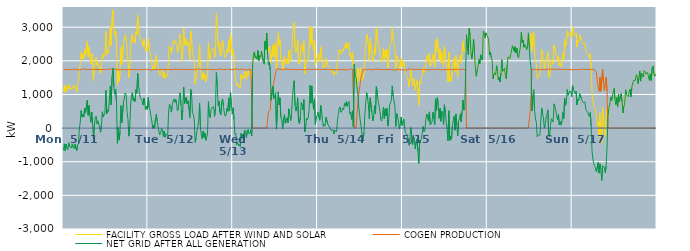
| Category | FACILITY GROSS LOAD AFTER WIND AND SOLAR | COGEN PRODUCTION | NET GRID AFTER ALL GENERATION |
|---|---|---|---|
|  Mon  5/11 | 1096 | 1757 | -661 |
|  Mon  5/11 | 1274 | 1743 | -469 |
|  Mon  5/11 | 1060 | 1737 | -677 |
|  Mon  5/11 | 1261 | 1736 | -475 |
|  Mon  5/11 | 1140 | 1742 | -602 |
|  Mon  5/11 | 1108 | 1754 | -646 |
|  Mon  5/11 | 1293 | 1730 | -437 |
|  Mon  5/11 | 1181 | 1740 | -559 |
|  Mon  5/11 | 1208 | 1742 | -534 |
|  Mon  5/11 | 1156 | 1742 | -586 |
|  Mon  5/11 | 1256 | 1727 | -471 |
|  Mon  5/11 | 1176 | 1745 | -569 |
|  Mon  5/11 | 1150 | 1766 | -616 |
|  Mon  5/11 | 1265 | 1737 | -472 |
|  Mon  5/11 | 1280 | 1738 | -458 |
|  Mon  5/11 | 1068 | 1737 | -669 |
|  Mon  5/11 | 1251 | 1745 | -494 |
|  Mon  5/11 | 1278 | 1737 | -459 |
|  Mon  5/11 | 1707 | 1726 | -19 |
|  Mon  5/11 | 1913 | 1751 | 162 |
|  Mon  5/11 | 2255 | 1736 | 519 |
|  Mon  5/11 | 2064 | 1739 | 325 |
|  Mon  5/11 | 2184 | 1765 | 419 |
|  Mon  5/11 | 2074 | 1746 | 328 |
|  Mon  5/11 | 2345 | 1756 | 589 |
|  Mon  5/11 | 2189 | 1739 | 450 |
|  Mon  5/11 | 2201 | 1740 | 461 |
|  Mon  5/11 | 2575 | 1751 | 824 |
|  Mon  5/11 | 2121 | 1742 | 379 |
|  Mon  5/11 | 2406 | 1733 | 673 |
|  Mon  5/11 | 2122 | 1747 | 375 |
|  Mon  5/11 | 1911 | 1736 | 175 |
|  Mon  5/11 | 2219 | 1741 | 478 |
|  Mon  5/11 | 1857 | 1750 | 107 |
|  Mon  5/11 | 1409 | 1746 | -337 |
|  Mon  5/11 | 1818 | 1746 | 72 |
|  Mon  5/11 | 2074 | 1754 | 320 |
|  Mon  5/11 | 2108 | 1751 | 357 |
|  Mon  5/11 | 1862 | 1739 | 123 |
|  Mon  5/11 | 1947 | 1733 | 214 |
|  Mon  5/11 | 1937 | 1738 | 199 |
|  Mon  5/11 | 1751 | 1731 | 20 |
|  Mon  5/11 | 1623 | 1745 | -122 |
|  Mon  5/11 | 1840 | 1749 | 91 |
|  Mon  5/11 | 2225 | 1739 | 486 |
|  Mon  5/11 | 2079 | 1749 | 330 |
|  Mon  5/11 | 2141 | 1737 | 404 |
|  Mon  5/11 | 2205 | 1750 | 455 |
|  Mon  5/11 | 2874 | 1751 | 1123 |
|  Mon  5/11 | 2177 | 1748 | 429 |
|  Mon  5/11 | 2280 | 1736 | 544 |
|  Mon  5/11 | 2240 | 1746 | 494 |
|  Mon  5/11 | 2267 | 1756 | 511 |
|  Mon  5/11 | 2994 | 1744 | 1250 |
|  Mon  5/11 | 2445 | 1752 | 693 |
|  Mon  5/11 | 3262 | 1740 | 1522 |
|  Mon  5/11 | 3521 | 1747 | 1774 |
|  Mon  5/11 | 3010 | 1759 | 1251 |
|  Mon  5/11 | 2769 | 1763 | 1006 |
|  Mon  5/11 | 2885 | 1736 | 1149 |
|  Mon  5/11 | 2522 | 1738 | 784 |
|  Mon  5/11 | 1294 | 1747 | -453 |
|  Mon  5/11 | 1755 | 1736 | 19 |
|  Mon  5/11 | 1386 | 1746 | -360 |
|  Mon  5/11 | 1616 | 1737 | -121 |
|  Mon  5/11 | 2411 | 1740 | 671 |
|  Mon  5/11 | 1898 | 1745 | 153 |
|  Mon  5/11 | 1900 | 1731 | 169 |
|  Mon  5/11 | 2516 | 1736 | 780 |
|  Mon  5/11 | 2514 | 1753 | 761 |
|  Mon  5/11 | 2785 | 1739 | 1046 |
|  Mon  5/11 | 2720 | 1743 | 977 |
|  Mon  5/11 | 2223 | 1737 | 486 |
|  Mon  5/11 | 1995 | 1743 | 252 |
|  Mon  5/11 | 1499 | 1739 | -240 |
|  Mon  5/11 | 1786 | 1745 | 41 |
|  Mon  5/11 | 2424 | 1743 | 681 |
|  Mon  5/11 | 2723 | 1742 | 981 |
|  Mon  5/11 | 2797 | 1746 | 1051 |
|  Mon  5/11 | 2565 | 1746 | 819 |
|  Mon  5/11 | 2628 | 1742 | 886 |
|  Mon  5/11 | 2523 | 1735 | 788 |
|  Mon  5/11 | 2875 | 1735 | 1140 |
|  Mon  5/11 | 2781 | 1747 | 1034 |
|  Mon  5/11 | 3363 | 1740 | 1623 |
|  Mon  5/11 | 3005 | 1740 | 1265 |
|  Mon  5/11 | 2765 | 1734 | 1031 |
|  Mon  5/11 | 2640 | 1735 | 905 |
|  Mon  5/11 | 2640 | 1743 | 897 |
|  Mon  5/11 | 2580 | 1751 | 829 |
|  Mon  5/11 | 2417 | 1734 | 683 |
|  Mon  5/11 | 2642 | 1748 | 894 |
|  Mon  5/11 | 2472 | 1745 | 727 |
|  Mon  5/11 | 2272 | 1729 | 543 |
|  Mon  5/11 | 2399 | 1744 | 655 |
|  Mon  5/11 | 2314 | 1753 | 561 |
|  Tue  5/12 | 2673 | 1751 | 922 |
|  Tue  5/12 | 2374 | 1759 | 615 |
|  Tue  5/12 | 2272 | 1729 | 543 |
|  Tue  5/12 | 2081 | 1733 | 348 |
|  Tue  5/12 | 1936 | 1725 | 211 |
|  Tue  5/12 | 1731 | 1740 | -9 |
|  Tue  5/12 | 1830 | 1744 | 86 |
|  Tue  5/12 | 1733 | 1740 | -7 |
|  Tue  5/12 | 1993 | 1737 | 256 |
|  Tue  5/12 | 2169 | 1754 | 415 |
|  Tue  5/12 | 1950 | 1740 | 210 |
|  Tue  5/12 | 1802 | 1750 | 52 |
|  Tue  5/12 | 1637 | 1732 | -95 |
|  Tue  5/12 | 1557 | 1763 | -206 |
|  Tue  5/12 | 1605 | 1730 | -125 |
|  Tue  5/12 | 1732 | 1741 | -9 |
|  Tue  5/12 | 1696 | 1751 | -55 |
|  Tue  5/12 | 1493 | 1741 | -248 |
|  Tue  5/12 | 1653 | 1741 | -88 |
|  Tue  5/12 | 1471 | 1743 | -272 |
|  Tue  5/12 | 1562 | 1742 | -180 |
|  Tue  5/12 | 1588 | 1742 | -154 |
|  Tue  5/12 | 1561 | 1748 | -187 |
|  Tue  5/12 | 2258 | 1748 | 510 |
|  Tue  5/12 | 2450 | 1740 | 710 |
|  Tue  5/12 | 2387 | 1722 | 665 |
|  Tue  5/12 | 2212 | 1736 | 476 |
|  Tue  5/12 | 2380 | 1740 | 640 |
|  Tue  5/12 | 2547 | 1743 | 804 |
|  Tue  5/12 | 2629 | 1758 | 871 |
|  Tue  5/12 | 2516 | 1753 | 763 |
|  Tue  5/12 | 2581 | 1731 | 850 |
|  Tue  5/12 | 2482 | 1752 | 730 |
|  Tue  5/12 | 2244 | 1735 | 509 |
|  Tue  5/12 | 2340 | 1738 | 602 |
|  Tue  5/12 | 2636 | 1736 | 900 |
|  Tue  5/12 | 2790 | 1743 | 1047 |
|  Tue  5/12 | 2416 | 1735 | 681 |
|  Tue  5/12 | 1988 | 1747 | 241 |
|  Tue  5/12 | 2279 | 1746 | 533 |
|  Tue  5/12 | 2968 | 1747 | 1221 |
|  Tue  5/12 | 2452 | 1728 | 724 |
|  Tue  5/12 | 2455 | 1749 | 706 |
|  Tue  5/12 | 2667 | 1748 | 919 |
|  Tue  5/12 | 2460 | 1741 | 719 |
|  Tue  5/12 | 2561 | 1753 | 808 |
|  Tue  5/12 | 2321 | 1751 | 570 |
|  Tue  5/12 | 2040 | 1731 | 309 |
|  Tue  5/12 | 2885 | 1735 | 1150 |
|  Tue  5/12 | 2731 | 1743 | 988 |
|  Tue  5/12 | 2189 | 1745 | 444 |
|  Tue  5/12 | 2154 | 1742 | 412 |
|  Tue  5/12 | 1979 | 1733 | 246 |
|  Tue  5/12 | 1304 | 1726 | -422 |
|  Tue  5/12 | 1452 | 1755 | -303 |
|  Tue  5/12 | 1640 | 1739 | -99 |
|  Tue  5/12 | 1792 | 1753 | 39 |
|  Tue  5/12 | 1944 | 1727 | 217 |
|  Tue  5/12 | 2491 | 1746 | 745 |
|  Tue  5/12 | 1767 | 1751 | 16 |
|  Tue  5/12 | 1522 | 1742 | -220 |
|  Tue  5/12 | 1426 | 1741 | -315 |
|  Tue  5/12 | 1648 | 1734 | -86 |
|  Tue  5/12 | 1467 | 1743 | -276 |
|  Tue  5/12 | 1598 | 1741 | -143 |
|  Tue  5/12 | 1383 | 1745 | -362 |
|  Tue  5/12 | 1471 | 1747 | -276 |
|  Tue  5/12 | 1554 | 1728 | -174 |
|  Tue  5/12 | 2548 | 1757 | 791 |
|  Tue  5/12 | 2080 | 1729 | 351 |
|  Tue  5/12 | 2040 | 1737 | 303 |
|  Tue  5/12 | 2286 | 1740 | 546 |
|  Tue  5/12 | 2346 | 1745 | 601 |
|  Tue  5/12 | 2338 | 1750 | 588 |
|  Tue  5/12 | 2372 | 1735 | 637 |
|  Tue  5/12 | 2103 | 1753 | 350 |
|  Tue  5/12 | 2309 | 1742 | 567 |
|  Tue  5/12 | 3404 | 1750 | 1654 |
|  Tue  5/12 | 3024 | 1743 | 1281 |
|  Tue  5/12 | 2415 | 1742 | 673 |
|  Tue  5/12 | 2564 | 1764 | 800 |
|  Tue  5/12 | 2205 | 1744 | 461 |
|  Tue  5/12 | 2144 | 1749 | 395 |
|  Tue  5/12 | 2508 | 1743 | 765 |
|  Tue  5/12 | 2609 | 1741 | 868 |
|  Tue  5/12 | 2388 | 1736 | 652 |
|  Tue  5/12 | 2185 | 1737 | 448 |
|  Tue  5/12 | 2092 | 1738 | 354 |
|  Tue  5/12 | 2142 | 1745 | 397 |
|  Tue  5/12 | 2330 | 1745 | 585 |
|  Tue  5/12 | 2256 | 1756 | 500 |
|  Tue  5/12 | 2633 | 1736 | 897 |
|  Tue  5/12 | 2263 | 1744 | 519 |
|  Tue  5/12 | 2821 | 1751 | 1070 |
|  Tue  5/12 | 2431 | 1739 | 692 |
|  Tue  5/12 | 2165 | 1751 | 414 |
|  Wed  5/13 | 2344 | 1742 | 602 |
|  Wed  5/13 | 2010 | 1760 | 250 |
|  Wed  5/13 | 1566 | 1752 | -186 |
|  Wed  5/13 | 1588 | 1740 | -152 |
|  Wed  5/13 | 1269 | 1760 | -491 |
|  Wed  5/13 | 1335 | 1758 | -423 |
|  Wed  5/13 | 1218 | 1747 | -529 |
|  Wed  5/13 | 1265 | 1749 | -484 |
|  Wed  5/13 | 1199 | 1743 | -544 |
|  Wed  5/13 | 1594 | 1753 | -159 |
|  Wed  5/13 | 1482 | 1764 | -282 |
|  Wed  5/13 | 1552 | 1738 | -186 |
|  Wed  5/13 | 1460 | 1733 | -273 |
|  Wed  5/13 | 1701 | 1756 | -55 |
|  Wed  5/13 | 1626 | 1736 | -110 |
|  Wed  5/13 | 1448 | 1738 | -290 |
|  Wed  5/13 | 1657 | 1740 | -83 |
|  Wed  5/13 | 1701 | 1735 | -34 |
|  Wed  5/13 | 1565 | 1746 | -181 |
|  Wed  5/13 | 1611 | 1758 | -147 |
|  Wed  5/13 | 1691 | 1746 | -55 |
|  Wed  5/13 | 1507 | 1742 | -235 |
|  Wed  5/13 | 1882 | 0 | 1882 |
|  Wed  5/13 | 2196 | 0 | 2196 |
|  Wed  5/13 | 2265 | 0 | 2265 |
|  Wed  5/13 | 2086 | 0 | 2086 |
|  Wed  5/13 | 2120 | 0 | 2120 |
|  Wed  5/13 | 2046 | 0 | 2046 |
|  Wed  5/13 | 2305 | 0 | 2305 |
|  Wed  5/13 | 2005 | 0 | 2005 |
|  Wed  5/13 | 2158 | 0 | 2158 |
|  Wed  5/13 | 2108 | 0 | 2108 |
|  Wed  5/13 | 2291 | 0 | 2291 |
|  Wed  5/13 | 2277 | 0 | 2277 |
|  Wed  5/13 | 1986 | 0 | 1986 |
|  Wed  5/13 | 1898 | 0 | 1898 |
|  Wed  5/13 | 2581 | 0 | 2581 |
|  Wed  5/13 | 2338 | 0 | 2338 |
|  Wed  5/13 | 2827 | 0 | 2827 |
|  Wed  5/13 | 2188 | 0 | 2188 |
|  Wed  5/13 | 2377 | 497 | 1880 |
|  Wed  5/13 | 2441 | 491 | 1950 |
|  Wed  5/13 | 2241 | 532 | 1709 |
|  Wed  5/13 | 1952 | 1124 | 828 |
|  Wed  5/13 | 1957 | 1141 | 816 |
|  Wed  5/13 | 2472 | 1234 | 1238 |
|  Wed  5/13 | 2123 | 1244 | 879 |
|  Wed  5/13 | 2437 | 1491 | 946 |
|  Wed  5/13 | 2550 | 1501 | 1049 |
|  Wed  5/13 | 1721 | 1752 | -31 |
|  Wed  5/13 | 2329 | 1750 | 579 |
|  Wed  5/13 | 2840 | 1762 | 1078 |
|  Wed  5/13 | 2447 | 1754 | 693 |
|  Wed  5/13 | 2645 | 1746 | 899 |
|  Wed  5/13 | 2059 | 1740 | 319 |
|  Wed  5/13 | 1981 | 1744 | 237 |
|  Wed  5/13 | 1723 | 1742 | -19 |
|  Wed  5/13 | 2013 | 1729 | 284 |
|  Wed  5/13 | 2147 | 1748 | 399 |
|  Wed  5/13 | 1894 | 1750 | 144 |
|  Wed  5/13 | 1948 | 1732 | 216 |
|  Wed  5/13 | 2066 | 1760 | 306 |
|  Wed  5/13 | 1906 | 1742 | 164 |
|  Wed  5/13 | 2318 | 1746 | 572 |
|  Wed  5/13 | 2152 | 1745 | 407 |
|  Wed  5/13 | 1969 | 1747 | 222 |
|  Wed  5/13 | 2125 | 1741 | 384 |
|  Wed  5/13 | 2635 | 1752 | 883 |
|  Wed  5/13 | 2939 | 1742 | 1197 |
|  Wed  5/13 | 3138 | 1729 | 1409 |
|  Wed  5/13 | 2400 | 1739 | 661 |
|  Wed  5/13 | 2253 | 1748 | 505 |
|  Wed  5/13 | 2360 | 1735 | 625 |
|  Wed  5/13 | 2630 | 1731 | 899 |
|  Wed  5/13 | 1943 | 1746 | 197 |
|  Wed  5/13 | 1876 | 1747 | 129 |
|  Wed  5/13 | 2084 | 1749 | 335 |
|  Wed  5/13 | 2501 | 1742 | 759 |
|  Wed  5/13 | 2444 | 1746 | 698 |
|  Wed  5/13 | 2273 | 1735 | 538 |
|  Wed  5/13 | 2597 | 1750 | 847 |
|  Wed  5/13 | 1615 | 1732 | -117 |
|  Wed  5/13 | 1732 | 1724 | 8 |
|  Wed  5/13 | 2030 | 1738 | 292 |
|  Wed  5/13 | 1987 | 1744 | 243 |
|  Wed  5/13 | 2085 | 1758 | 327 |
|  Wed  5/13 | 2323 | 1749 | 574 |
|  Wed  5/13 | 3018 | 1744 | 1274 |
|  Wed  5/13 | 2485 | 1744 | 741 |
|  Wed  5/13 | 2994 | 1740 | 1254 |
|  Wed  5/13 | 2492 | 1731 | 761 |
|  Wed  5/13 | 2312 | 1752 | 560 |
|  Wed  5/13 | 2617 | 1748 | 869 |
|  Wed  5/13 | 1856 | 1752 | 104 |
|  Wed  5/13 | 2070 | 1743 | 327 |
|  Wed  5/13 | 2112 | 1738 | 374 |
|  Thu  5/14 | 2198 | 1729 | 469 |
|  Thu  5/14 | 2199 | 1751 | 448 |
|  Thu  5/14 | 1962 | 1728 | 234 |
|  Thu  5/14 | 2415 | 1742 | 673 |
|  Thu  5/14 | 2274 | 1759 | 515 |
|  Thu  5/14 | 1982 | 1747 | 235 |
|  Thu  5/14 | 1790 | 1743 | 47 |
|  Thu  5/14 | 1870 | 1750 | 120 |
|  Thu  5/14 | 1817 | 1744 | 73 |
|  Thu  5/14 | 2077 | 1749 | 328 |
|  Thu  5/14 | 2075 | 1740 | 335 |
|  Thu  5/14 | 1862 | 1743 | 119 |
|  Thu  5/14 | 1874 | 1754 | 120 |
|  Thu  5/14 | 1782 | 1755 | 27 |
|  Thu  5/14 | 1750 | 1734 | 16 |
|  Thu  5/14 | 1653 | 1730 | -77 |
|  Thu  5/14 | 1668 | 1738 | -70 |
|  Thu  5/14 | 1697 | 1742 | -45 |
|  Thu  5/14 | 1563 | 1734 | -171 |
|  Thu  5/14 | 1668 | 1738 | -70 |
|  Thu  5/14 | 1647 | 1743 | -96 |
|  Thu  5/14 | 1630 | 1735 | -105 |
|  Thu  5/14 | 1975 | 1732 | 243 |
|  Thu  5/14 | 2159 | 1753 | 406 |
|  Thu  5/14 | 2349 | 1749 | 600 |
|  Thu  5/14 | 2369 | 1737 | 632 |
|  Thu  5/14 | 2206 | 1736 | 470 |
|  Thu  5/14 | 2253 | 1733 | 520 |
|  Thu  5/14 | 2352 | 1758 | 594 |
|  Thu  5/14 | 2292 | 1746 | 546 |
|  Thu  5/14 | 2466 | 1732 | 734 |
|  Thu  5/14 | 2394 | 1735 | 659 |
|  Thu  5/14 | 2546 | 1757 | 789 |
|  Thu  5/14 | 2365 | 1719 | 646 |
|  Thu  5/14 | 2491 | 1744 | 747 |
|  Thu  5/14 | 2538 | 1744 | 794 |
|  Thu  5/14 | 2156 | 1739 | 417 |
|  Thu  5/14 | 2229 | 1764 | 465 |
|  Thu  5/14 | 2026 | 1768 | 258 |
|  Thu  5/14 | 2258 | 1747 | 511 |
|  Thu  5/14 | 1793 | 1754 | 39 |
|  Thu  5/14 | 1894 | 0 | 1894 |
|  Thu  5/14 | 1547 | 0 | 1547 |
|  Thu  5/14 | 1500 | 0 | 1500 |
|  Thu  5/14 | 1246 | 0 | 1246 |
|  Thu  5/14 | 1786 | 736 | 1050 |
|  Thu  5/14 | 1638 | 983 | 655 |
|  Thu  5/14 | 1386 | 985 | 401 |
|  Thu  5/14 | 1808 | 1382 | 426 |
|  Thu  5/14 | 1531 | 1546 | -15 |
|  Thu  5/14 | 1415 | 1651 | -236 |
|  Thu  5/14 | 1396 | 1735 | -339 |
|  Thu  5/14 | 1602 | 1734 | -132 |
|  Thu  5/14 | 2155 | 1740 | 415 |
|  Thu  5/14 | 2498 | 1742 | 756 |
|  Thu  5/14 | 2793 | 1735 | 1058 |
|  Thu  5/14 | 2655 | 1750 | 905 |
|  Thu  5/14 | 2447 | 1749 | 698 |
|  Thu  5/14 | 2026 | 1745 | 281 |
|  Thu  5/14 | 2652 | 1750 | 902 |
|  Thu  5/14 | 2661 | 1739 | 922 |
|  Thu  5/14 | 2205 | 1733 | 472 |
|  Thu  5/14 | 1965 | 1751 | 214 |
|  Thu  5/14 | 2096 | 1731 | 365 |
|  Thu  5/14 | 2412 | 1745 | 667 |
|  Thu  5/14 | 2176 | 1754 | 422 |
|  Thu  5/14 | 2985 | 1753 | 1232 |
|  Thu  5/14 | 2815 | 1745 | 1070 |
|  Thu  5/14 | 2532 | 1752 | 780 |
|  Thu  5/14 | 2440 | 1762 | 678 |
|  Thu  5/14 | 2248 | 1750 | 498 |
|  Thu  5/14 | 1992 | 1736 | 256 |
|  Thu  5/14 | 1953 | 1746 | 207 |
|  Thu  5/14 | 2121 | 1744 | 377 |
|  Thu  5/14 | 2373 | 1749 | 624 |
|  Thu  5/14 | 2018 | 1732 | 286 |
|  Thu  5/14 | 2322 | 1747 | 575 |
|  Thu  5/14 | 2106 | 1745 | 361 |
|  Thu  5/14 | 2333 | 1743 | 590 |
|  Thu  5/14 | 1796 | 1736 | 60 |
|  Thu  5/14 | 1999 | 1756 | 243 |
|  Thu  5/14 | 2450 | 1755 | 695 |
|  Thu  5/14 | 2498 | 1760 | 738 |
|  Thu  5/14 | 2580 | 1740 | 840 |
|  Thu  5/14 | 2994 | 1740 | 1254 |
|  Thu  5/14 | 2679 | 1731 | 948 |
|  Thu  5/14 | 2702 | 1745 | 957 |
|  Thu  5/14 | 2367 | 1722 | 645 |
|  Thu  5/14 | 1780 | 1733 | 47 |
|  Thu  5/14 | 2156 | 1728 | 428 |
|  Thu  5/14 | 2109 | 1747 | 362 |
|  Thu  5/14 | 1950 | 1748 | 202 |
|  Thu  5/14 | 1705 | 1734 | -29 |
|  Thu  5/14 | 1844 | 1739 | 105 |
|  Thu  5/14 | 2071 | 1743 | 328 |
|  Thu  5/14 | 1818 | 1737 | 81 |
|  Fri  5/15 | 1838 | 1741 | 97 |
|  Fri  5/15 | 1981 | 1719 | 262 |
|  Fri  5/15 | 1743 | 1746 | -3 |
|  Fri  5/15 | 1601 | 1732 | -131 |
|  Fri  5/15 | 1565 | 1739 | -174 |
|  Fri  5/15 | 1487 | 1720 | -233 |
|  Fri  5/15 | 1426 | 1752 | -326 |
|  Fri  5/15 | 1226 | 1735 | -509 |
|  Fri  5/15 | 1473 | 1771 | -298 |
|  Fri  5/15 | 1749 | 1734 | 15 |
|  Fri  5/15 | 1490 | 1743 | -253 |
|  Fri  5/15 | 1249 | 1740 | -491 |
|  Fri  5/15 | 1491 | 1743 | -252 |
|  Fri  5/15 | 1411 | 1750 | -339 |
|  Fri  5/15 | 1134 | 1754 | -620 |
|  Fri  5/15 | 1327 | 1746 | -419 |
|  Fri  5/15 | 1415 | 1742 | -327 |
|  Fri  5/15 | 1061 | 1748 | -687 |
|  Fri  5/15 | 676 | 1727 | -1051 |
|  Fri  5/15 | 1388 | 1743 | -355 |
|  Fri  5/15 | 1330 | 1740 | -410 |
|  Fri  5/15 | 1447 | 1744 | -297 |
|  Fri  5/15 | 1601 | 1744 | -143 |
|  Fri  5/15 | 1796 | 1746 | 50 |
|  Fri  5/15 | 1644 | 1747 | -103 |
|  Fri  5/15 | 1690 | 1740 | -50 |
|  Fri  5/15 | 1995 | 1741 | 254 |
|  Fri  5/15 | 2160 | 1742 | 418 |
|  Fri  5/15 | 2063 | 1752 | 311 |
|  Fri  5/15 | 1938 | 1731 | 207 |
|  Fri  5/15 | 2231 | 1749 | 482 |
|  Fri  5/15 | 1841 | 1742 | 99 |
|  Fri  5/15 | 1822 | 1738 | 84 |
|  Fri  5/15 | 1923 | 1740 | 183 |
|  Fri  5/15 | 2204 | 1732 | 472 |
|  Fri  5/15 | 2044 | 1748 | 296 |
|  Fri  5/15 | 1818 | 1720 | 98 |
|  Fri  5/15 | 2610 | 1740 | 870 |
|  Fri  5/15 | 2258 | 1750 | 508 |
|  Fri  5/15 | 2662 | 1752 | 910 |
|  Fri  5/15 | 2428 | 1746 | 682 |
|  Fri  5/15 | 2038 | 1750 | 288 |
|  Fri  5/15 | 2339 | 1754 | 585 |
|  Fri  5/15 | 1940 | 1738 | 202 |
|  Fri  5/15 | 2245 | 1740 | 505 |
|  Fri  5/15 | 2191 | 1727 | 464 |
|  Fri  5/15 | 1829 | 1736 | 93 |
|  Fri  5/15 | 2429 | 1736 | 693 |
|  Fri  5/15 | 2224 | 1747 | 477 |
|  Fri  5/15 | 1937 | 1737 | 200 |
|  Fri  5/15 | 1698 | 1727 | -29 |
|  Fri  5/15 | 1371 | 1750 | -379 |
|  Fri  5/15 | 2256 | 1741 | 515 |
|  Fri  5/15 | 1382 | 1749 | -367 |
|  Fri  5/15 | 1505 | 1738 | -233 |
|  Fri  5/15 | 1412 | 1743 | -331 |
|  Fri  5/15 | 1803 | 1747 | 56 |
|  Fri  5/15 | 1939 | 1733 | 206 |
|  Fri  5/15 | 2084 | 1735 | 349 |
|  Fri  5/15 | 1690 | 1753 | -63 |
|  Fri  5/15 | 2160 | 1737 | 423 |
|  Fri  5/15 | 1842 | 1747 | 95 |
|  Fri  5/15 | 1508 | 1739 | -231 |
|  Fri  5/15 | 1966 | 1749 | 217 |
|  Fri  5/15 | 2016 | 1741 | 275 |
|  Fri  5/15 | 2157 | 1733 | 424 |
|  Fri  5/15 | 1932 | 1747 | 185 |
|  Fri  5/15 | 2251 | 1753 | 498 |
|  Fri  5/15 | 2581 | 1743 | 838 |
|  Fri  5/15 | 2274 | 1742 | 532 |
|  Fri  5/15 | 2331 | 1743 | 588 |
|  Fri  5/15 | 2295 | 1735 | 560 |
|  Fri  5/15 | 2773 | 0 | 2773 |
|  Fri  5/15 | 2378 | 0 | 2378 |
|  Fri  5/15 | 2180 | 0 | 2180 |
|  Fri  5/15 | 2965 | 0 | 2965 |
|  Fri  5/15 | 2763 | 0 | 2763 |
|  Fri  5/15 | 2267 | 0 | 2267 |
|  Fri  5/15 | 2057 | 0 | 2057 |
|  Fri  5/15 | 2308 | 0 | 2308 |
|  Fri  5/15 | 2639 | 0 | 2639 |
|  Fri  5/15 | 2246 | 0 | 2246 |
|  Fri  5/15 | 1819 | 0 | 1819 |
|  Fri  5/15 | 1541 | 0 | 1541 |
|  Fri  5/15 | 1702 | 0 | 1702 |
|  Fri  5/15 | 1832 | 0 | 1832 |
|  Fri  5/15 | 2035 | 0 | 2035 |
|  Fri  5/15 | 1909 | 0 | 1909 |
|  Fri  5/15 | 2180 | 0 | 2180 |
|  Fri  5/15 | 2053 | 0 | 2053 |
|  Fri  5/15 | 2018 | 0 | 2018 |
|  Fri  5/15 | 2886 | 0 | 2886 |
|  Fri  5/15 | 2843 | 0 | 2843 |
|  Fri  5/15 | 2681 | 0 | 2681 |
|  Fri  5/15 | 2831 | 0 | 2831 |
|  Fri  5/15 | 2819 | 0 | 2819 |
|  Sat  5/16 | 2715 | 0 | 2715 |
|  Sat  5/16 | 2621 | 0 | 2621 |
|  Sat  5/16 | 2176 | 0 | 2176 |
|  Sat  5/16 | 2263 | 0 | 2263 |
|  Sat  5/16 | 2096 | 0 | 2096 |
|  Sat  5/16 | 2013 | 0 | 2013 |
|  Sat  5/16 | 1468 | 0 | 1468 |
|  Sat  5/16 | 1587 | 0 | 1587 |
|  Sat  5/16 | 1644 | 0 | 1644 |
|  Sat  5/16 | 1592 | 0 | 1592 |
|  Sat  5/16 | 1856 | 0 | 1856 |
|  Sat  5/16 | 1689 | 0 | 1689 |
|  Sat  5/16 | 1436 | 0 | 1436 |
|  Sat  5/16 | 1513 | 0 | 1513 |
|  Sat  5/16 | 1370 | 0 | 1370 |
|  Sat  5/16 | 1643 | 0 | 1643 |
|  Sat  5/16 | 2030 | 0 | 2030 |
|  Sat  5/16 | 1688 | 0 | 1688 |
|  Sat  5/16 | 1660 | 0 | 1660 |
|  Sat  5/16 | 1776 | 0 | 1776 |
|  Sat  5/16 | 1556 | 0 | 1556 |
|  Sat  5/16 | 1467 | 0 | 1467 |
|  Sat  5/16 | 1876 | 0 | 1876 |
|  Sat  5/16 | 2120 | 0 | 2120 |
|  Sat  5/16 | 2146 | 0 | 2146 |
|  Sat  5/16 | 2062 | 0 | 2062 |
|  Sat  5/16 | 2198 | 0 | 2198 |
|  Sat  5/16 | 2194 | 0 | 2194 |
|  Sat  5/16 | 2447 | 0 | 2447 |
|  Sat  5/16 | 2461 | 0 | 2461 |
|  Sat  5/16 | 2279 | 0 | 2279 |
|  Sat  5/16 | 2419 | 0 | 2419 |
|  Sat  5/16 | 2231 | 0 | 2231 |
|  Sat  5/16 | 2373 | 0 | 2373 |
|  Sat  5/16 | 2133 | 0 | 2133 |
|  Sat  5/16 | 2084 | 0 | 2084 |
|  Sat  5/16 | 2260 | 0 | 2260 |
|  Sat  5/16 | 2423 | 0 | 2423 |
|  Sat  5/16 | 2850 | 0 | 2850 |
|  Sat  5/16 | 2533 | 0 | 2533 |
|  Sat  5/16 | 2610 | 0 | 2610 |
|  Sat  5/16 | 2403 | 0 | 2403 |
|  Sat  5/16 | 2484 | 0 | 2484 |
|  Sat  5/16 | 2423 | 0 | 2423 |
|  Sat  5/16 | 2334 | 0 | 2334 |
|  Sat  5/16 | 2454 | 0 | 2454 |
|  Sat  5/16 | 2831 | 0 | 2831 |
|  Sat  5/16 | 2419 | 0 | 2419 |
|  Sat  5/16 | 2478 | 498 | 1980 |
|  Sat  5/16 | 2818 | 999 | 1819 |
|  Sat  5/16 | 2266 | 1758 | 508 |
|  Sat  5/16 | 2699 | 1757 | 942 |
|  Sat  5/16 | 2878 | 1736 | 1142 |
|  Sat  5/16 | 2275 | 1748 | 527 |
|  Sat  5/16 | 2025 | 1752 | 273 |
|  Sat  5/16 | 1910 | 1743 | 167 |
|  Sat  5/16 | 1476 | 1738 | -262 |
|  Sat  5/16 | 1527 | 1743 | -216 |
|  Sat  5/16 | 1506 | 1732 | -226 |
|  Sat  5/16 | 1545 | 1749 | -204 |
|  Sat  5/16 | 1546 | 1743 | -197 |
|  Sat  5/16 | 2334 | 1734 | 600 |
|  Sat  5/16 | 2175 | 1737 | 438 |
|  Sat  5/16 | 2058 | 1744 | 314 |
|  Sat  5/16 | 1748 | 1751 | -3 |
|  Sat  5/16 | 1848 | 1751 | 97 |
|  Sat  5/16 | 2052 | 1723 | 329 |
|  Sat  5/16 | 2131 | 1757 | 374 |
|  Sat  5/16 | 2273 | 1730 | 543 |
|  Sat  5/16 | 1539 | 1743 | -204 |
|  Sat  5/16 | 1490 | 1742 | -252 |
|  Sat  5/16 | 1831 | 1755 | 76 |
|  Sat  5/16 | 2024 | 1744 | 280 |
|  Sat  5/16 | 2032 | 1746 | 286 |
|  Sat  5/16 | 1913 | 1727 | 186 |
|  Sat  5/16 | 2470 | 1750 | 720 |
|  Sat  5/16 | 2395 | 1751 | 644 |
|  Sat  5/16 | 2377 | 1745 | 632 |
|  Sat  5/16 | 2104 | 1739 | 365 |
|  Sat  5/16 | 1994 | 1751 | 243 |
|  Sat  5/16 | 2148 | 1746 | 402 |
|  Sat  5/16 | 1852 | 1753 | 99 |
|  Sat  5/16 | 1915 | 1725 | 190 |
|  Sat  5/16 | 1821 | 1732 | 89 |
|  Sat  5/16 | 1969 | 1746 | 223 |
|  Sat  5/16 | 2213 | 1747 | 466 |
|  Sat  5/16 | 2017 | 1737 | 280 |
|  Sat  5/16 | 2642 | 1748 | 894 |
|  Sat  5/16 | 2426 | 1746 | 680 |
|  Sat  5/16 | 2545 | 1746 | 799 |
|  Sat  5/16 | 2893 | 1746 | 1147 |
|  Sat  5/16 | 2717 | 1738 | 979 |
|  Sat  5/16 | 2695 | 1735 | 960 |
|  Sat  5/16 | 2850 | 1745 | 1105 |
|  Sat  5/16 | 2816 | 1742 | 1074 |
|  Sat  5/16 | 2667 | 1737 | 930 |
|  Sun  5/17 | 3009 | 1746 | 1263 |
|  Sun  5/17 | 2874 | 1733 | 1141 |
|  Sun  5/17 | 2879 | 1733 | 1146 |
|  Sun  5/17 | 2769 | 1743 | 1026 |
|  Sun  5/17 | 2829 | 1737 | 1092 |
|  Sun  5/17 | 2419 | 1731 | 688 |
|  Sun  5/17 | 2604 | 1738 | 866 |
|  Sun  5/17 | 2564 | 1745 | 819 |
|  Sun  5/17 | 2774 | 1749 | 1025 |
|  Sun  5/17 | 2755 | 1742 | 1013 |
|  Sun  5/17 | 2615 | 1744 | 871 |
|  Sun  5/17 | 2623 | 1755 | 868 |
|  Sun  5/17 | 2489 | 1735 | 754 |
|  Sun  5/17 | 2497 | 1744 | 753 |
|  Sun  5/17 | 2521 | 1744 | 777 |
|  Sun  5/17 | 2297 | 1745 | 552 |
|  Sun  5/17 | 2263 | 1738 | 525 |
|  Sun  5/17 | 2223 | 1750 | 473 |
|  Sun  5/17 | 2134 | 1744 | 390 |
|  Sun  5/17 | 2081 | 1738 | 343 |
|  Sun  5/17 | 2209 | 1745 | 464 |
|  Sun  5/17 | 1811 | 1747 | 64 |
|  Sun  5/17 | 1057 | 1743 | -686 |
|  Sun  5/17 | 825 | 1740 | -915 |
|  Sun  5/17 | 678 | 1738 | -1060 |
|  Sun  5/17 | 617 | 1733 | -1116 |
|  Sun  5/17 | 614 | 1738 | -1124 |
|  Sun  5/17 | 350 | 1652 | -1302 |
|  Sun  5/17 | 82 | 1380 | -1298 |
|  Sun  5/17 | 185 | 1205 | -1020 |
|  Sun  5/17 | -245 | 1096 | -1341 |
|  Sun  5/17 | 453 | 1517 | -1064 |
|  Sun  5/17 | -142 | 1093 | -1235 |
|  Sun  5/17 | -451 | 1102 | -1553 |
|  Sun  5/17 | 625 | 1748 | -1123 |
|  Sun  5/17 | 207 | 1319 | -1112 |
|  Sun  5/17 | -45 | 1121 | -1166 |
|  Sun  5/17 | -241 | 1095 | -1336 |
|  Sun  5/17 | 388 | 1513 | -1125 |
|  Sun  5/17 | 562 | 1096 | -534 |
|  Sun  5/17 | 328 | 0 | 328 |
|  Sun  5/17 | 591 | 0 | 591 |
|  Sun  5/17 | 686 | 0 | 686 |
|  Sun  5/17 | 919 | 0 | 919 |
|  Sun  5/17 | 806 | 0 | 806 |
|  Sun  5/17 | 957 | 0 | 957 |
|  Sun  5/17 | 938 | 0 | 938 |
|  Sun  5/17 | 1178 | 0 | 1178 |
|  Sun  5/17 | 846 | 0 | 846 |
|  Sun  5/17 | 697 | 0 | 697 |
|  Sun  5/17 | 909 | 0 | 909 |
|  Sun  5/17 | 633 | 0 | 633 |
|  Sun  5/17 | 1004 | 0 | 1004 |
|  Sun  5/17 | 786 | 0 | 786 |
|  Sun  5/17 | 930 | 0 | 930 |
|  Sun  5/17 | 1023 | 0 | 1023 |
|  Sun  5/17 | 781 | 0 | 781 |
|  Sun  5/17 | 451 | 0 | 451 |
|  Sun  5/17 | 635 | 0 | 635 |
|  Sun  5/17 | 745 | 0 | 745 |
|  Sun  5/17 | 1138 | 0 | 1138 |
|  Sun  5/17 | 999 | 0 | 999 |
|  Sun  5/17 | 1001 | 0 | 1001 |
|  Sun  5/17 | 933 | 0 | 933 |
|  Sun  5/17 | 1069 | 0 | 1069 |
|  Sun  5/17 | 1152 | 0 | 1152 |
|  Sun  5/17 | 927 | 0 | 927 |
|  Sun  5/17 | 1208 | 0 | 1208 |
|  Sun  5/17 | 1339 | 0 | 1339 |
|  Sun  5/17 | 1419 | 0 | 1419 |
|  Sun  5/17 | 1401 | 0 | 1401 |
|  Sun  5/17 | 1420 | 0 | 1420 |
|  Sun  5/17 | 1589 | 0 | 1589 |
|  Sun  5/17 | 1554 | 0 | 1554 |
|  Sun  5/17 | 1323 | 0 | 1323 |
|  Sun  5/17 | 1481 | 0 | 1481 |
|  Sun  5/17 | 1699 | 0 | 1699 |
|  Sun  5/17 | 1396 | 0 | 1396 |
|  Sun  5/17 | 1632 | 0 | 1632 |
|  Sun  5/17 | 1569 | 0 | 1569 |
|  Sun  5/17 | 1512 | 0 | 1512 |
|  Sun  5/17 | 1712 | 0 | 1712 |
|  Sun  5/17 | 1676 | 0 | 1676 |
|  Sun  5/17 | 1605 | 0 | 1605 |
|  Sun  5/17 | 1623 | 0 | 1623 |
|  Sun  5/17 | 1657 | 0 | 1657 |
|  Sun  5/17 | 1495 | 0 | 1495 |
|  Sun  5/17 | 1415 | 0 | 1415 |
|  Sun  5/17 | 1611 | 0 | 1611 |
|  Sun  5/17 | 1417 | 0 | 1417 |
|  Sun  5/17 | 1782 | 0 | 1782 |
|  Sun  5/17 | 1851 | 0 | 1851 |
|  Sun  5/17 | 1609 | 0 | 1609 |
|  Sun  5/17 | 1543 | 0 | 1543 |
|  Sun  5/17 | 1574 | 0 | 1574 |
|  Sun  5/17 | 1635 | 0 | 1635 |